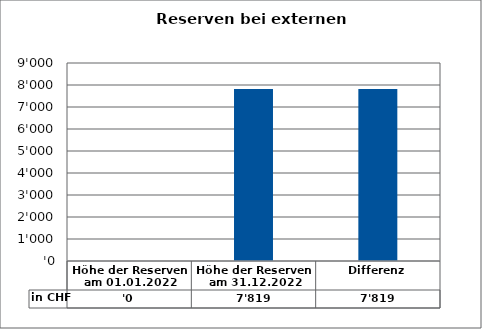
| Category | in CHF |
|---|---|
| Höhe der Reserven am 01.01.2022 | 0 |
| Höhe der Reserven am 31.12.2022 | 7819.39 |
| Differenz | 7819.39 |